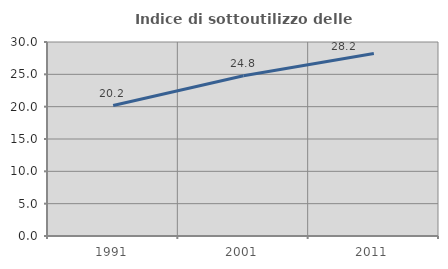
| Category | Indice di sottoutilizzo delle abitazioni  |
|---|---|
| 1991.0 | 20.175 |
| 2001.0 | 24.783 |
| 2011.0 | 28.214 |